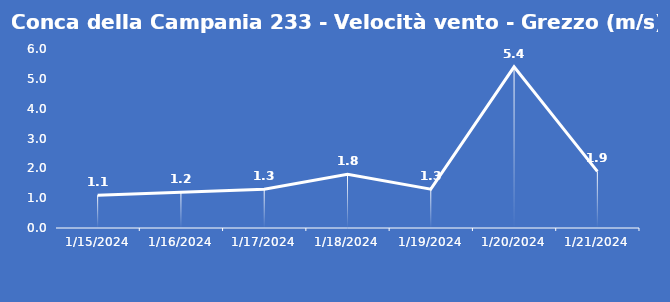
| Category | Conca della Campania 233 - Velocità vento - Grezzo (m/s) |
|---|---|
| 1/15/24 | 1.1 |
| 1/16/24 | 1.2 |
| 1/17/24 | 1.3 |
| 1/18/24 | 1.8 |
| 1/19/24 | 1.3 |
| 1/20/24 | 5.4 |
| 1/21/24 | 1.9 |